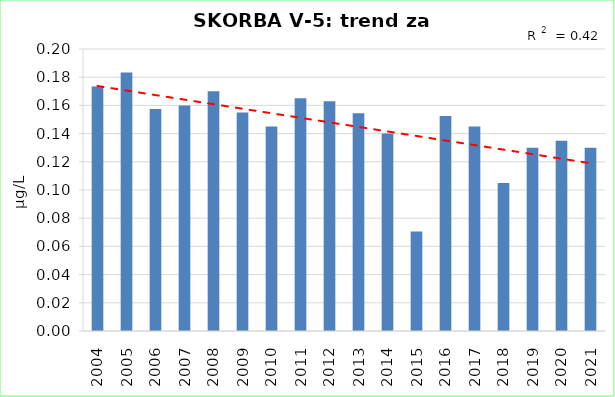
| Category | Vsota |
|---|---|
| 2004 | 0.173 |
| 2005 | 0.183 |
| 2006 | 0.158 |
| 2007 | 0.16 |
| 2008 | 0.17 |
| 2009 | 0.155 |
| 2010 | 0.145 |
| 2011 | 0.165 |
| 2012 | 0.163 |
| 2013 | 0.154 |
| 2014 | 0.14 |
| 2015 | 0.07 |
| 2016 | 0.153 |
| 2017 | 0.145 |
| 2018 | 0.105 |
| 2019 | 0.13 |
| 2020 | 0.135 |
| 2021 | 0.13 |